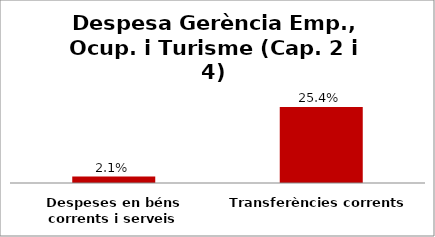
| Category | Series 0 |
|---|---|
| Despeses en béns corrents i serveis | 0.021 |
| Transferències corrents | 0.254 |